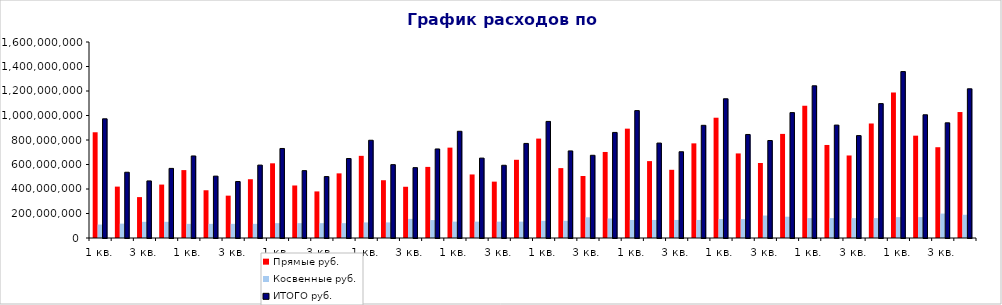
| Category | Прямые | Косвенные | ИТОГО |
|---|---|---|---|
| 1 кв. | 863127000 | 109886250 | 973013250 |
| 2 кв. | 419550000 | 117282321.429 | 536832321.429 |
| 3 кв. | 333840500 | 132074464.286 | 465914964.286 |
| 4 кв. | 436087000 | 132074464.286 | 568161464.286 |
| 1 кв. | 554268200 | 115380562.5 | 669648762.5 |
| 2 кв. | 389715700 | 115380562.5 | 505096262.5 |
| 3 кв. | 345698650 | 115380562.5 | 461079212.5 |
| 4 кв. | 479695700 | 115380562.5 | 595076262.5 |
| 1 кв. | 609695020 | 121149590.625 | 730844610.625 |
| 2 кв. | 428687270 | 121149590.625 | 549836860.625 |
| 3 кв. | 380268515 | 121149590.625 | 501418105.625 |
| 4 кв. | 527665270 | 121149590.625 | 648814860.625 |
| 1 кв. | 670664522 | 127207070.156 | 797871592.156 |
| 2 кв. | 471555997 | 127207070.156 | 598763067.156 |
| 3 кв. | 418295366.5 | 156007070.156 | 574302436.656 |
| 4 кв. | 580431797 | 146407070.156 | 726838867.156 |
| 1 кв. | 737730974.2 | 133567423.664 | 871298397.864 |
| 2 кв. | 518711596.7 | 133567423.664 | 652279020.364 |
| 3 кв. | 460124903.15 | 133567423.664 | 593692326.814 |
| 4 кв. | 638474976.7 | 133567423.664 | 772042400.364 |
| 1 кв. | 811504071.62 | 140245794.847 | 951749866.467 |
| 2 кв. | 570582756.37 | 140245794.847 | 710828551.217 |
| 3 кв. | 506137393.465 | 169045794.847 | 675183188.312 |
| 4 кв. | 702322474.37 | 159445794.847 | 861768269.217 |
| 1 кв. | 892654478.782 | 147258084.59 | 1039912563.372 |
| 2 кв. | 627641032.007 | 147258084.59 | 774899116.597 |
| 3 кв. | 556751132.812 | 147258084.59 | 704009217.401 |
| 4 кв. | 772554721.807 | 147258084.59 | 919812806.397 |
| 1 кв. | 981919926.66 | 154620988.819 | 1136540915.479 |
| 2 кв. | 690405135.208 | 154620988.819 | 845026124.027 |
| 3 кв. | 612426246.093 | 183420988.819 | 795847234.912 |
| 4 кв. | 849810193.988 | 173820988.819 | 1023631182.807 |
| 1 кв. | 1080111919.326 | 162352038.26 | 1242463957.586 |
| 2 кв. | 759445648.728 | 162352038.26 | 921797686.989 |
| 3 кв. | 673668870.702 | 162352038.26 | 836020908.962 |
| 4 кв. | 934791213.386 | 162352038.26 | 1097143251.647 |
| 1 кв. | 1188123111.259 | 170469640.173 | 1358592751.432 |
| 2 кв. | 835390213.601 | 170469640.173 | 1005859853.774 |
| 3 кв. | 741035757.772 | 199269640.173 | 940305397.945 |
| 4 кв. | 1028270334.725 | 189669640.173 | 1217939974.898 |